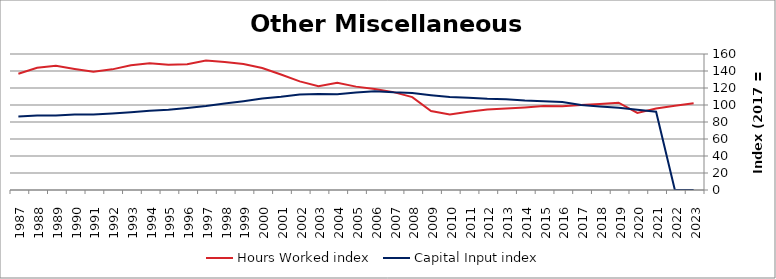
| Category | Hours Worked index | Capital Input index |
|---|---|---|
| 2023.0 | 102.139 | 0 |
| 2022.0 | 99.059 | 0 |
| 2021.0 | 95.931 | 92.126 |
| 2020.0 | 90.702 | 94.516 |
| 2019.0 | 102.729 | 96.745 |
| 2018.0 | 101.147 | 98.143 |
| 2017.0 | 100 | 100 |
| 2016.0 | 98.559 | 103.413 |
| 2015.0 | 98.955 | 104.429 |
| 2014.0 | 97.195 | 105.156 |
| 2013.0 | 95.816 | 106.625 |
| 2012.0 | 94.688 | 107.296 |
| 2011.0 | 92.065 | 108.662 |
| 2010.0 | 88.865 | 109.453 |
| 2009.0 | 92.905 | 111.585 |
| 2008.0 | 109.257 | 114.137 |
| 2007.0 | 115.158 | 114.861 |
| 2006.0 | 118.91 | 116.202 |
| 2005.0 | 121.612 | 114.762 |
| 2004.0 | 126.172 | 112.6 |
| 2003.0 | 122.144 | 113.043 |
| 2002.0 | 127.829 | 112.383 |
| 2001.0 | 135.881 | 109.646 |
| 2000.0 | 143.514 | 107.716 |
| 1999.0 | 148.118 | 104.518 |
| 1998.0 | 150.514 | 101.807 |
| 1997.0 | 152.378 | 98.806 |
| 1996.0 | 148.044 | 96.552 |
| 1995.0 | 147.472 | 94.291 |
| 1994.0 | 149.234 | 93.09 |
| 1993.0 | 146.693 | 91.594 |
| 1992.0 | 141.934 | 90.021 |
| 1991.0 | 139.187 | 88.702 |
| 1990.0 | 142.383 | 88.891 |
| 1989.0 | 146.077 | 87.731 |
| 1988.0 | 143.78 | 87.55 |
| 1987.0 | 136.776 | 86.402 |